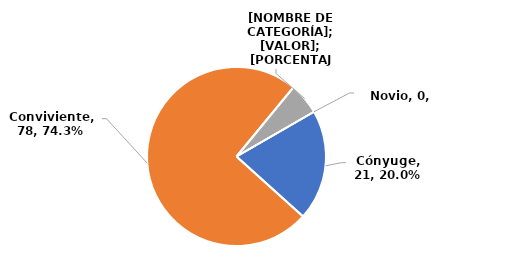
| Category | Series 0 |
|---|---|
| Cónyuge | 21 |
| Conviviente | 78 |
| Enamorado | 6 |
| Novio | 0 |